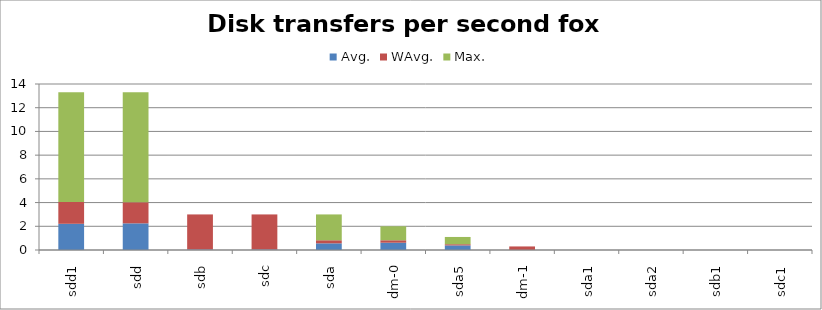
| Category | Avg. | WAvg. | Max. |
|---|---|---|---|
| sdd1 | 2.21 | 1.842 | 9.248 |
| sdd | 2.248 | 1.774 | 9.278 |
| sdb | 0.05 | 2.95 | 0 |
| sdc | 0.05 | 2.95 | 0 |
| sda | 0.562 | 0.26 | 2.178 |
| dm-0 | 0.615 | 0.206 | 1.179 |
| sda5 | 0.388 | 0.1 | 0.612 |
| dm-1 | 0.005 | 0.295 | 0 |
| sda1 | 0 | 0 | 0 |
| sda2 | 0 | 0 | 0 |
| sdb1 | 0 | 0 | 0 |
| sdc1 | 0 | 0 | 0 |